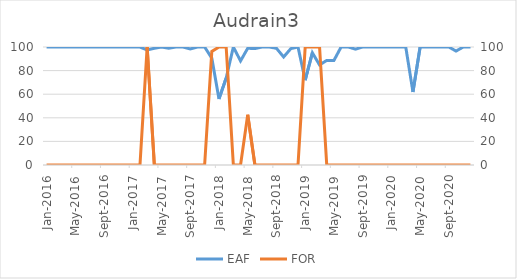
| Category | EAF |
|---|---|
| 2016-01-01 | 100 |
| 2016-02-01 | 100 |
| 2016-03-01 | 100 |
| 2016-04-01 | 100 |
| 2016-05-01 | 100 |
| 2016-06-01 | 100 |
| 2016-07-01 | 100 |
| 2016-08-01 | 100 |
| 2016-09-01 | 100 |
| 2016-10-01 | 100 |
| 2016-11-01 | 100 |
| 2016-12-01 | 100 |
| 2017-01-01 | 100 |
| 2017-02-01 | 100 |
| 2017-03-01 | 97.51 |
| 2017-04-01 | 98.96 |
| 2017-05-01 | 100 |
| 2017-06-01 | 99.03 |
| 2017-07-01 | 100 |
| 2017-08-01 | 100 |
| 2017-09-01 | 98.37 |
| 2017-10-01 | 100 |
| 2017-11-01 | 100 |
| 2017-12-01 | 90.53 |
| 2018-01-01 | 56.01 |
| 2018-02-01 | 73.69 |
| 2018-03-01 | 100 |
| 2018-04-01 | 88.21 |
| 2018-05-01 | 98.93 |
| 2018-06-01 | 98.66 |
| 2018-07-01 | 100 |
| 2018-08-01 | 100 |
| 2018-09-01 | 98.89 |
| 2018-10-01 | 91.55 |
| 2018-11-01 | 98.62 |
| 2018-12-01 | 100 |
| 2019-01-01 | 71.91 |
| 2019-02-01 | 95.09 |
| 2019-03-01 | 84.79 |
| 2019-04-01 | 88.66 |
| 2019-05-01 | 88.61 |
| 2019-06-01 | 100 |
| 2019-07-01 | 100 |
| 2019-08-01 | 98.17 |
| 2019-09-01 | 100 |
| 2019-10-01 | 100 |
| 2019-11-01 | 100 |
| 2019-12-01 | 100 |
| 2020-01-01 | 100 |
| 2020-02-01 | 100 |
| 2020-03-01 | 100 |
| 2020-04-01 | 61.88 |
| 2020-05-01 | 100 |
| 2020-06-01 | 100 |
| 2020-07-01 | 100 |
| 2020-08-01 | 100 |
| 2020-09-01 | 100 |
| 2020-10-01 | 96.55 |
| 2020-11-01 | 100 |
| 2020-12-01 | 100 |